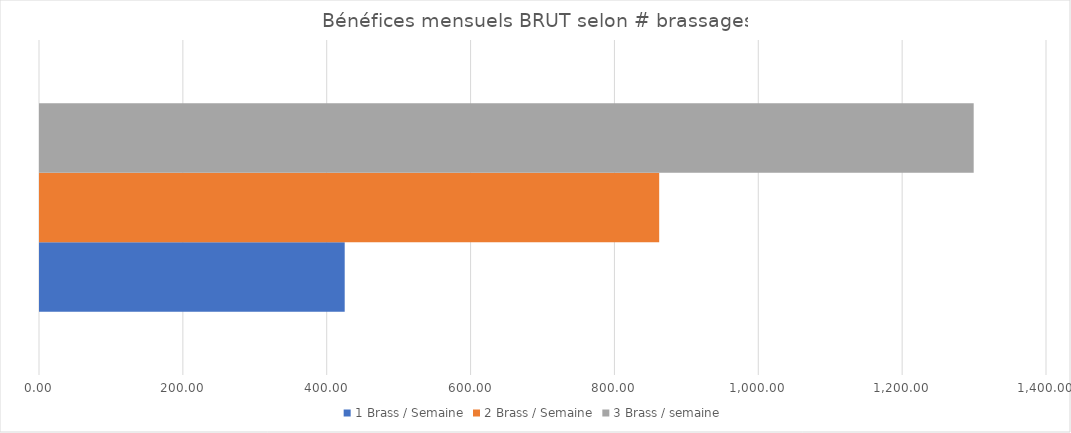
| Category | 1 Brass / Semaine | 2 Brass / Semaine | 3 Brass / semaine |
|---|---|---|---|
| Bénéfices commercial mensuel moyen NET | 423.624 | 860.847 | 1298.071 |